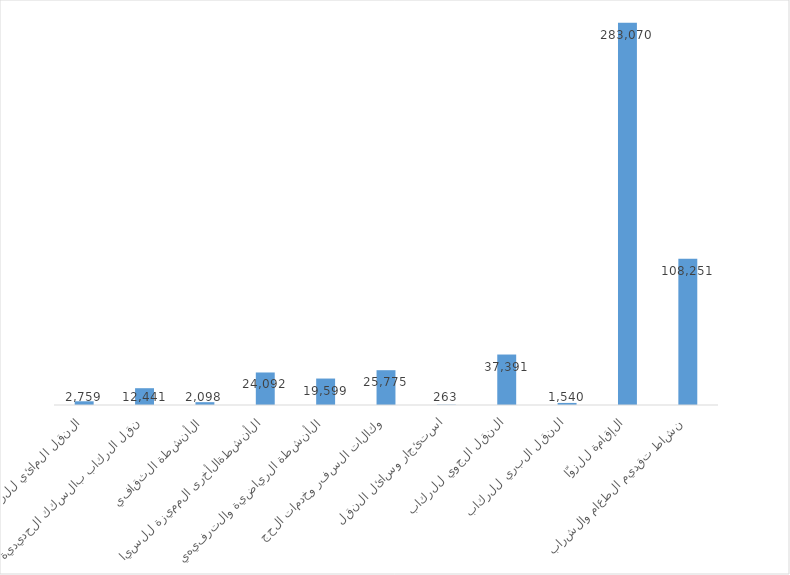
| Category | Series 0 |
|---|---|
| نشاط تقديم الطعام والشراب | 108251 |
| الإقامة للزوّار | 283070 |
| النقل البري للركاب | 1540 |
| النقل الجوي للركاب | 37391 |
| استئجار وسائل النقل | 263 |
| وكالات السفر وخدمات الحجز | 25775 |
| الأنشطة الرياضية والترفيهية | 19599 |
| الأنشطةالأخرى المميزة للسياحة | 24092 |
| الأنشطة الثقافية | 2098 |
| نقل الركاب بالسكك الحديدية | 12441 |
| النقل المائي للركاب | 2759 |